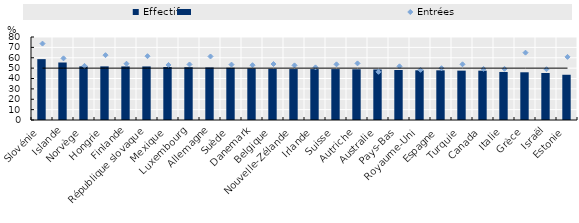
| Category | Effectifs |
|---|---|
| Slovénie | 58.665 |
| Islande | 55.425 |
| Norvège | 51.694 |
| Hongrie | 51.669 |
| Finlande | 51.631 |
| République slovaque | 51.621 |
| Mexique | 51.041 |
| Luxembourg | 50.874 |
| Allemagne | 50.643 |
| Suède | 50.355 |
| Danemark | 49.78 |
| Belgique | 49.382 |
| Nouvelle-Zélande | 49.097 |
| Irlande | 49.078 |
| Suisse | 49.073 |
| Autriche | 48.897 |
| Australie | 48.681 |
| Pays-Bas | 48.185 |
| Royaume-Uni | 47.915 |
| Espagne | 47.873 |
| Turquie | 47.582 |
| Canada | 47.561 |
| Italie | 46.3 |
| Grèce | 45.994 |
| Israël | 45.31 |
| Estonie | 43.606 |